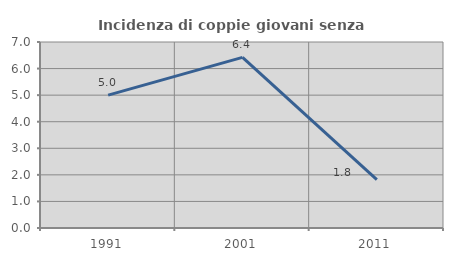
| Category | Incidenza di coppie giovani senza figli |
|---|---|
| 1991.0 | 5 |
| 2001.0 | 6.422 |
| 2011.0 | 1.818 |